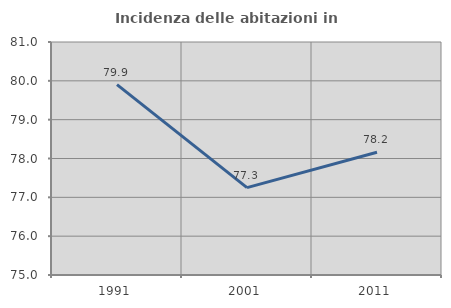
| Category | Incidenza delle abitazioni in proprietà  |
|---|---|
| 1991.0 | 79.904 |
| 2001.0 | 77.251 |
| 2011.0 | 78.16 |